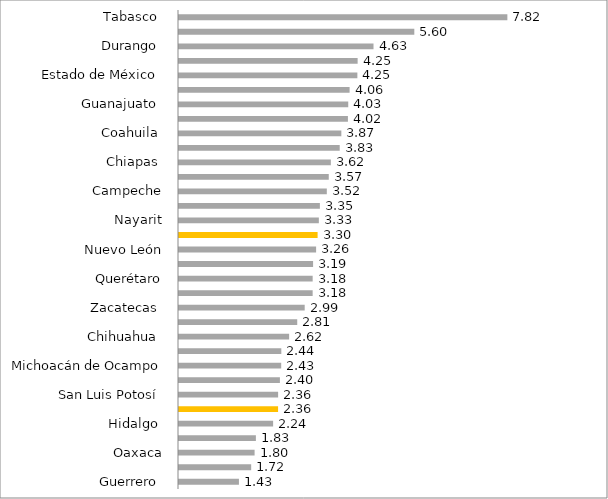
| Category | Series 0 |
|---|---|
| Guerrero  | 1.427 |
| Yucatán | 1.718 |
| Oaxaca | 1.8 |
| Morelos  | 1.831 |
| Hidalgo  | 2.241 |
| Jalisco | 2.359 |
| San Luis Potosí  | 2.36 |
| Veracruz  | 2.403 |
| Michoacán de Ocampo | 2.433 |
| Baja California | 2.436 |
| Chihuahua  | 2.622 |
| Puebla  | 2.815 |
| Zacatecas  | 2.993 |
| Baja California Sur  | 3.182 |
| Querétaro | 3.182 |
| Quintana Roo  | 3.193 |
| Nuevo León | 3.264 |
| Nacional | 3.3 |
| Nayarit | 3.33 |
| Aguascalientes  | 3.354 |
| Campeche | 3.519 |
| Sinaloa  | 3.566 |
| Chiapas  | 3.615 |
| Tamaulipas  | 3.827 |
| Coahuila  | 3.865 |
| Tlaxcala | 4.022 |
| Guanajuato  | 4.029 |
| Colima  | 4.062 |
| Estado de México  | 4.247 |
| Sonora  | 4.253 |
| Durango  | 4.631 |
| Ciudad de México | 5.603 |
| Tabasco  | 7.818 |